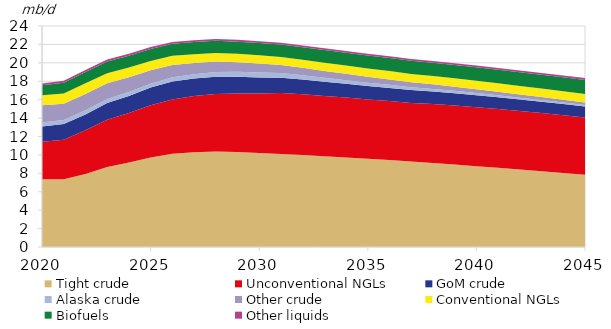
| Category | Tight crude | Unconventional NGLs | GoM crude | Alaska crude | Other crude | Conventional NGLs | Biofuels | Other liquids |
|---|---|---|---|---|---|---|---|---|
| 2020-01-01 | 7.344 | 4.075 | 1.666 | 0.448 | 1.86 | 1.099 | 1.062 | 0.206 |
| 2021-01-01 | 7.344 | 4.306 | 1.707 | 0.437 | 1.765 | 1.119 | 1.152 | 0.211 |
| 2022-01-01 | 7.93 | 4.74 | 1.73 | 0.437 | 1.79 | 1.167 | 1.218 | 0.221 |
| 2023-01-01 | 8.68 | 5.13 | 1.82 | 0.445 | 1.715 | 1.09 | 1.252 | 0.231 |
| 2024-01-01 | 9.18 | 5.37 | 1.84 | 0.454 | 1.578 | 1.06 | 1.286 | 0.225 |
| 2025-01-01 | 9.728 | 5.668 | 1.913 | 0.428 | 1.452 | 1.017 | 1.293 | 0.217 |
| 2026-01-01 | 10.115 | 5.912 | 1.951 | 0.462 | 1.336 | 0.983 | 1.301 | 0.212 |
| 2027-01-01 | 10.285 | 6.104 | 1.914 | 0.458 | 1.229 | 0.955 | 1.308 | 0.207 |
| 2028-01-01 | 10.38 | 6.229 | 1.882 | 0.515 | 1.131 | 0.937 | 1.316 | 0.203 |
| 2029-01-01 | 10.305 | 6.378 | 1.802 | 0.534 | 1.04 | 0.916 | 1.323 | 0.199 |
| 2030-01-01 | 10.207 | 6.474 | 1.728 | 0.551 | 0.957 | 0.902 | 1.336 | 0.197 |
| 2031-01-01 | 10.099 | 6.619 | 1.659 | 0.507 | 0.88 | 0.882 | 1.348 | 0.194 |
| 2032-01-01 | 9.983 | 6.6 | 1.597 | 0.466 | 0.81 | 0.884 | 1.361 | 0.193 |
| 2033-01-01 | 9.858 | 6.534 | 1.549 | 0.429 | 0.745 | 0.894 | 1.373 | 0.191 |
| 2034-01-01 | 9.724 | 6.498 | 1.505 | 0.395 | 0.686 | 0.899 | 1.386 | 0.19 |
| 2035-01-01 | 9.584 | 6.437 | 1.465 | 0.363 | 0.631 | 0.908 | 1.398 | 0.19 |
| 2036-01-01 | 9.435 | 6.415 | 1.427 | 0.334 | 0.58 | 0.911 | 1.411 | 0.189 |
| 2037-01-01 | 9.28 | 6.363 | 1.393 | 0.307 | 0.534 | 0.918 | 1.423 | 0.189 |
| 2038-01-01 | 9.119 | 6.407 | 1.362 | 0.283 | 0.491 | 0.912 | 1.436 | 0.189 |
| 2039-01-01 | 8.951 | 6.42 | 1.333 | 0.26 | 0.452 | 0.91 | 1.448 | 0.19 |
| 2040-01-01 | 8.779 | 6.393 | 1.306 | 0.239 | 0.416 | 0.914 | 1.461 | 0.19 |
| 2041-01-01 | 8.601 | 6.383 | 1.282 | 0.22 | 0.382 | 0.915 | 1.473 | 0.187 |
| 2042-01-01 | 8.418 | 6.338 | 1.259 | 0.203 | 0.352 | 0.922 | 1.486 | 0.188 |
| 2043-01-01 | 8.232 | 6.315 | 1.238 | 0.186 | 0.324 | 0.925 | 1.498 | 0.189 |
| 2044-01-01 | 8.042 | 6.261 | 1.219 | 0.171 | 0.298 | 0.933 | 1.511 | 0.19 |
| 2045-01-01 | 7.85 | 6.201 | 1.202 | 0.158 | 0.274 | 0.941 | 1.523 | 0.192 |